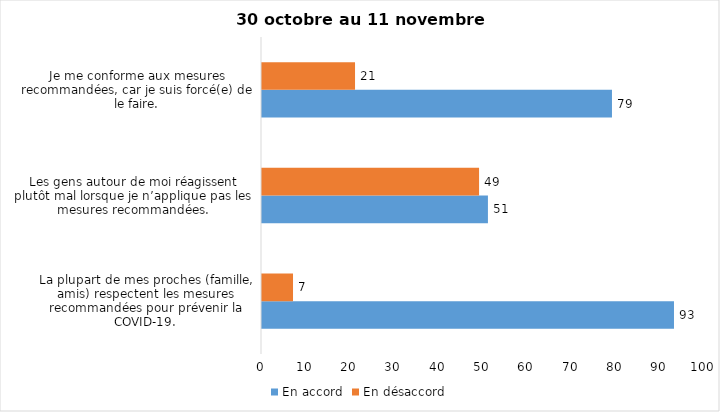
| Category | En accord | En désaccord |
|---|---|---|
| La plupart de mes proches (famille, amis) respectent les mesures recommandées pour prévenir la COVID-19. | 93 | 7 |
| Les gens autour de moi réagissent plutôt mal lorsque je n’applique pas les mesures recommandées. | 51 | 49 |
| Je me conforme aux mesures recommandées, car je suis forcé(e) de le faire. | 79 | 21 |